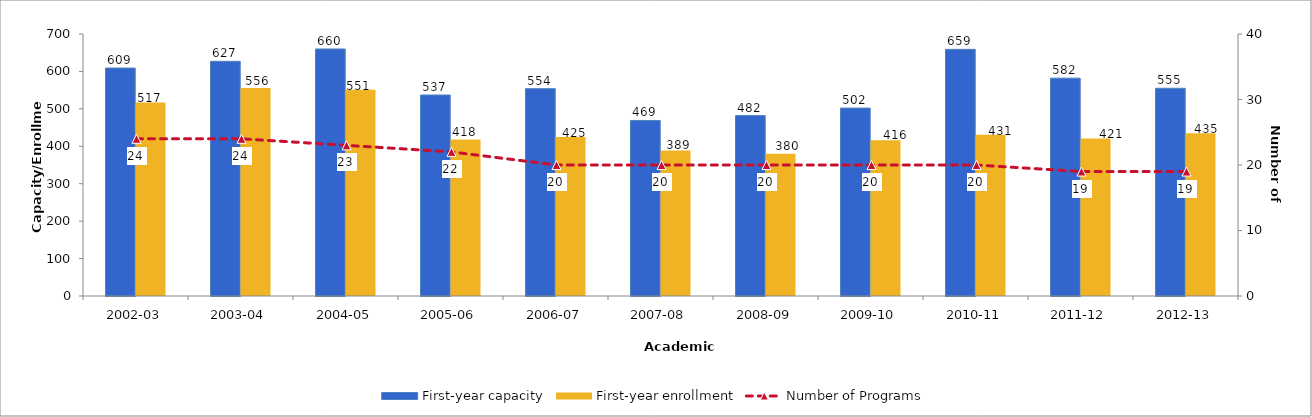
| Category | First-year capacity | First-year enrollment |
|---|---|---|
| 2002-03 | 609 | 517 |
| 2003-04 | 627 | 556 |
| 2004-05 | 660 | 551 |
| 2005-06 | 537 | 418 |
| 2006-07 | 554 | 425 |
| 2007-08 | 469 | 389 |
| 2008-09 | 482 | 380 |
| 2009-10 | 502 | 416 |
| 2010-11 | 659 | 431 |
| 2011-12 | 582 | 421 |
| 2012-13 | 555 | 435 |